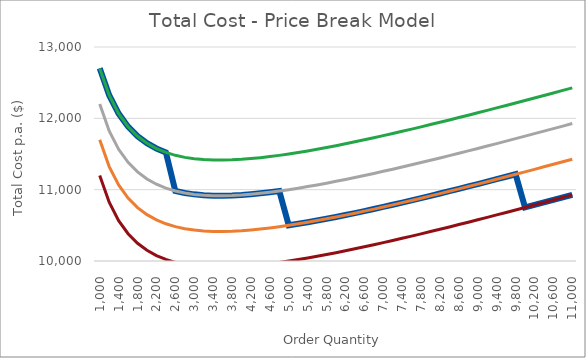
| Category | Series 0 | Total Cost @ $1 | Total Cost @ $0.95 | Total Cost @ $0.9 | Total Cost @ $0.85 |
|---|---|---|---|---|---|
| 1000.0 | 12701 | 12700 | 12200 | 11700 | 11200 |
| 1200.0 | 12324.333 | 12323.333 | 11823.333 | 11323.333 | 10823.333 |
| 1400.0 | 12066.714 | 12065.714 | 11565.714 | 11065.714 | 10565.714 |
| 1600.0 | 11883.5 | 11882.5 | 11382.5 | 10882.5 | 10382.5 |
| 1800.0 | 11749.889 | 11748.889 | 11248.889 | 10748.889 | 10248.889 |
| 2000.0 | 11651 | 11650 | 11150 | 10650 | 10150 |
| 2200.0 | 11577.364 | 11576.364 | 11076.364 | 10576.364 | 10076.364 |
| 2400.0 | 11522.667 | 11521.667 | 11021.667 | 10521.667 | 10021.667 |
| 2600.0 | 10982.488 | 11481.538 | 10981.538 | 10481.538 | 9981.538 |
| 2800.0 | 10953.807 | 11452.857 | 10952.857 | 10452.857 | 9952.857 |
| 3000.0 | 10934.283 | 11433.333 | 10933.333 | 10433.333 | 9933.333 |
| 3200.0 | 10922.2 | 11421.25 | 10921.25 | 10421.25 | 9921.25 |
| 3400.0 | 10916.244 | 11415.294 | 10915.294 | 10415.294 | 9915.294 |
| 3600.0 | 10915.394 | 11414.444 | 10914.444 | 10414.444 | 9914.444 |
| 3800.0 | 10918.845 | 11417.895 | 10917.895 | 10417.895 | 9917.895 |
| 4000.0 | 10925.95 | 11425 | 10925 | 10425 | 9925 |
| 4200.0 | 10936.188 | 11435.238 | 10935.238 | 10435.238 | 9935.238 |
| 4400.0 | 10949.132 | 11448.182 | 10948.182 | 10448.182 | 9948.182 |
| 4600.0 | 10964.428 | 11463.478 | 10963.478 | 10463.478 | 9963.478 |
| 4800.0 | 10981.783 | 11480.833 | 10980.833 | 10480.833 | 9980.833 |
| 5000.0 | 10500.9 | 11500 | 11000 | 10500 | 10000 |
| 5200.0 | 10521.669 | 11520.769 | 11020.769 | 10520.769 | 10020.769 |
| 5400.0 | 10543.863 | 11542.963 | 11042.963 | 10542.963 | 10042.963 |
| 5600.0 | 10567.329 | 11566.429 | 11066.429 | 10566.429 | 10066.429 |
| 5800.0 | 10591.934 | 11591.034 | 11091.034 | 10591.034 | 10091.034 |
| 6000.0 | 10617.567 | 11616.667 | 11116.667 | 10616.667 | 10116.667 |
| 6200.0 | 10644.126 | 11643.226 | 11143.226 | 10643.226 | 10143.226 |
| 6400.0 | 10671.525 | 11670.625 | 11170.625 | 10670.625 | 10170.625 |
| 6600.0 | 10699.688 | 11698.788 | 11198.788 | 10698.788 | 10198.788 |
| 6800.0 | 10728.547 | 11727.647 | 11227.647 | 10727.647 | 10227.647 |
| 7000.0 | 10758.043 | 11757.143 | 11257.143 | 10757.143 | 10257.143 |
| 7200.0 | 10788.122 | 11787.222 | 11287.222 | 10787.222 | 10287.222 |
| 7400.0 | 10818.738 | 11817.838 | 11317.838 | 10817.838 | 10317.838 |
| 7600.0 | 10849.847 | 11848.947 | 11348.947 | 10848.947 | 10348.947 |
| 7800.0 | 10881.413 | 11880.513 | 11380.513 | 10880.513 | 10380.513 |
| 8000.0 | 10913.4 | 11912.5 | 11412.5 | 10912.5 | 10412.5 |
| 8200.0 | 10945.778 | 11944.878 | 11444.878 | 10944.878 | 10444.878 |
| 8400.0 | 10978.519 | 11977.619 | 11477.619 | 10977.619 | 10477.619 |
| 8600.0 | 11011.598 | 12010.698 | 11510.698 | 11010.698 | 10510.698 |
| 8800.0 | 11044.991 | 12044.091 | 11544.091 | 11044.091 | 10544.091 |
| 9000.0 | 11078.678 | 12077.778 | 11577.778 | 11077.778 | 10577.778 |
| 9200.0 | 11112.639 | 12111.739 | 11611.739 | 11111.739 | 10611.739 |
| 9400.0 | 11146.857 | 12145.957 | 11645.957 | 11145.957 | 10645.957 |
| 9600.0 | 11181.317 | 12180.417 | 11680.417 | 11180.417 | 10680.417 |
| 9800.0 | 11216.002 | 12215.102 | 11715.102 | 11215.102 | 10715.102 |
| 10000.0 | 10750.85 | 12250 | 11750 | 11250 | 10750 |
| 10200.0 | 10785.948 | 12285.098 | 11785.098 | 11285.098 | 10785.098 |
| 10400.0 | 10821.235 | 12320.385 | 11820.385 | 11320.385 | 10820.385 |
| 10600.0 | 10856.699 | 12355.849 | 11855.849 | 11355.849 | 10855.849 |
| 10800.0 | 10892.331 | 12391.481 | 11891.481 | 11391.481 | 10891.481 |
| 11000.0 | 10928.123 | 12427.273 | 11927.273 | 11427.273 | 10927.273 |